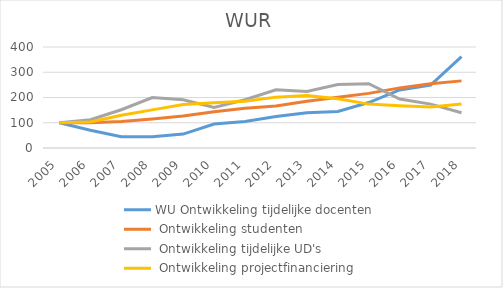
| Category | WU Ontwikkeling tijdelijke docenten | WU Ontwikkeling studenten | WU Ontwikkeling tijdelijke UD's | WU Ontwikkeling projectfinanciering |
|---|---|---|---|---|
| 2005.0 | 100 | 100 | 100 | 100 |
| 2006.0 | 70 | 99.688 | 112.121 | 102.688 |
| 2007.0 | 45 | 104.852 | 151.515 | 129.86 |
| 2008.0 | 45 | 114.779 | 200 | 151.059 |
| 2009.0 | 55 | 126.753 | 190.909 | 172.058 |
| 2010.0 | 95 | 143.712 | 160.606 | 179.666 |
| 2011.0 | 105 | 157.378 | 190.909 | 185.287 |
| 2012.0 | 125 | 166.726 | 230.303 | 201.469 |
| 2013.0 | 140 | 184.776 | 224.242 | 208.253 |
| 2014.0 | 145 | 201.024 | 251.515 | 195.052 |
| 2015.0 | 180 | 216.337 | 254.545 | 173.793 |
| 2016.0 | 230 | 238.059 | 193.939 | 167.771 |
| 2017.0 | 249.4 | 254.752 | 173.727 | 162.308 |
| 2018.0 | 361.9 | 265.836 | 139.606 | 174.415 |